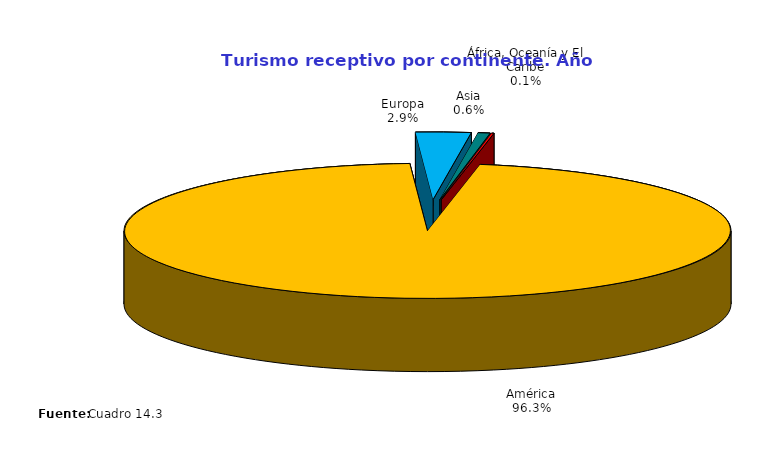
| Category | Series 0 |
|---|---|
| América | 1525245 |
| Europa | 46591 |
| Asia | 10105 |
| África, Oceanía y El Caribe | 1996 |